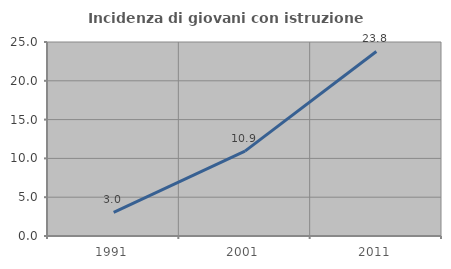
| Category | Incidenza di giovani con istruzione universitaria |
|---|---|
| 1991.0 | 3.039 |
| 2001.0 | 10.938 |
| 2011.0 | 23.776 |